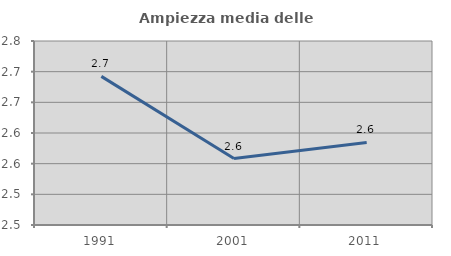
| Category | Ampiezza media delle famiglie |
|---|---|
| 1991.0 | 2.692 |
| 2001.0 | 2.558 |
| 2011.0 | 2.585 |